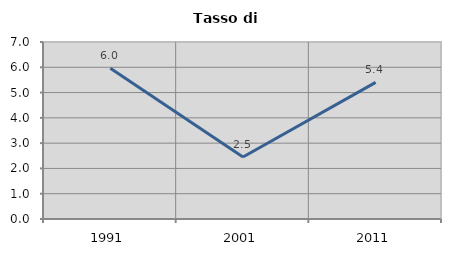
| Category | Tasso di disoccupazione   |
|---|---|
| 1991.0 | 5.961 |
| 2001.0 | 2.451 |
| 2011.0 | 5.403 |